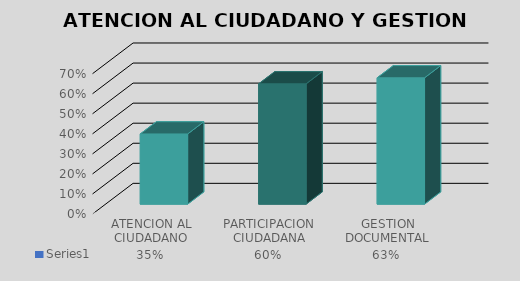
| Category | Series 0 |
|---|---|
| ATENCION AL CIUDADANO | 0.35 |
| PARTICIPACION CIUDADANA | 0.6 |
| GESTION DOCUMENTAL | 0.63 |